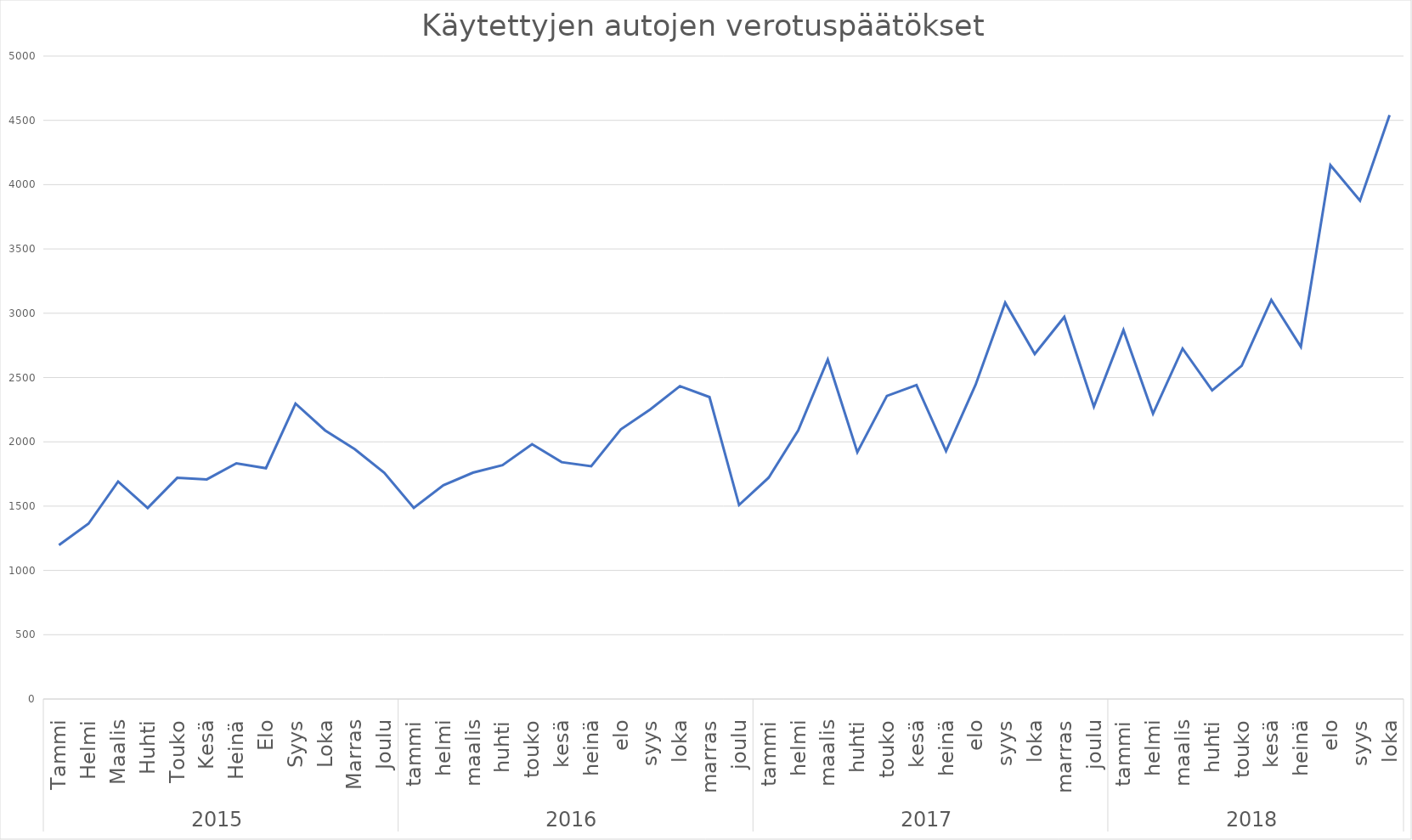
| Category | Series 0 |
|---|---|
| 0 | 1197 |
| 1 | 1364 |
| 2 | 1691 |
| 3 | 1485 |
| 4 | 1720 |
| 5 | 1708 |
| 6 | 1833 |
| 7 | 1795 |
| 8 | 2297 |
| 9 | 2089 |
| 10 | 1943 |
| 11 | 1760 |
| 12 | 1486 |
| 13 | 1662 |
| 14 | 1760 |
| 15 | 1819 |
| 16 | 1982 |
| 17 | 1842 |
| 18 | 1810 |
| 19 | 2097 |
| 20 | 2252 |
| 21 | 2433 |
| 22 | 2348 |
| 23 | 1509 |
| 24 | 1721 |
| 25 | 2088 |
| 26 | 2639 |
| 27 | 1919 |
| 28 | 2357 |
| 29 | 2442 |
| 30 | 1928 |
| 31 | 2444 |
| 32 | 3082 |
| 33 | 2683 |
| 34 | 2971 |
| 35 | 2273 |
| 36 | 2869 |
| 37 | 2219 |
| 38 | 2725 |
| 39 | 2400 |
| 40 | 2592 |
| 41 | 3103 |
| 42 | 2739 |
| 43 | 4151 |
| 44 | 3875 |
| 45 | 4541 |